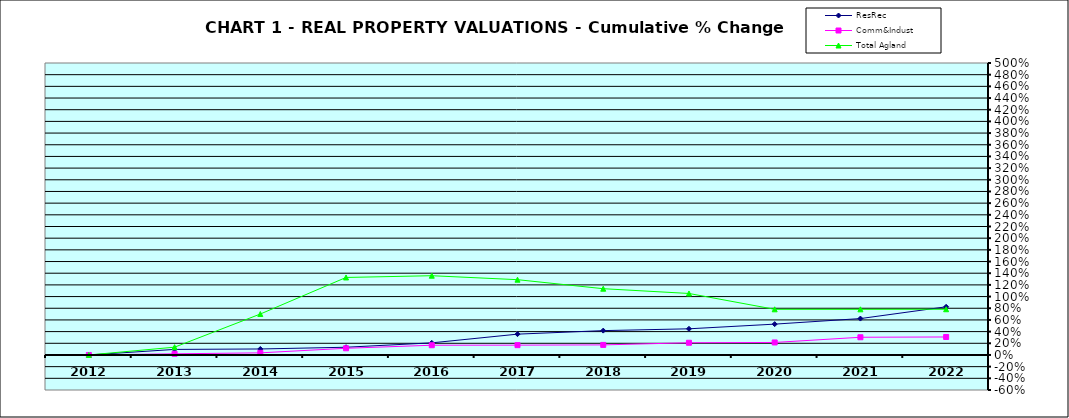
| Category | ResRec | Comm&Indust | Total Agland |
|---|---|---|---|
| 2012.0 | 0 | 0 | 0 |
| 2013.0 | 0.095 | 0.02 | 0.133 |
| 2014.0 | 0.102 | 0.036 | 0.701 |
| 2015.0 | 0.132 | 0.115 | 1.327 |
| 2016.0 | 0.207 | 0.167 | 1.357 |
| 2017.0 | 0.356 | 0.168 | 1.289 |
| 2018.0 | 0.417 | 0.172 | 1.135 |
| 2019.0 | 0.448 | 0.209 | 1.053 |
| 2020.0 | 0.528 | 0.214 | 0.782 |
| 2021.0 | 0.623 | 0.303 | 0.782 |
| 2022.0 | 0.825 | 0.308 | 0.783 |